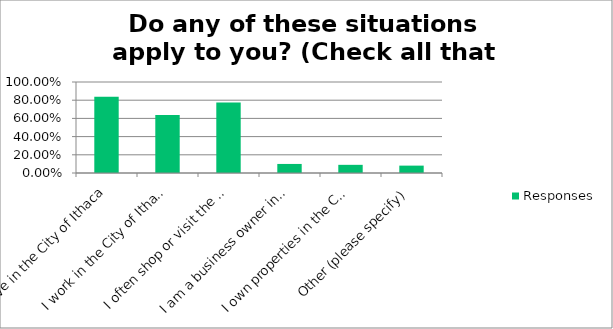
| Category | Responses |
|---|---|
| I live in the City of Ithaca | 0.838 |
| I work in the City of Ithaca | 0.636 |
| I often shop or visit the City of Ithaca | 0.774 |
| I am a business owner in the City of Ithaca | 0.099 |
| I own properties in the City of Ithaca other than my primary residence | 0.09 |
| Other (please specify) | 0.081 |